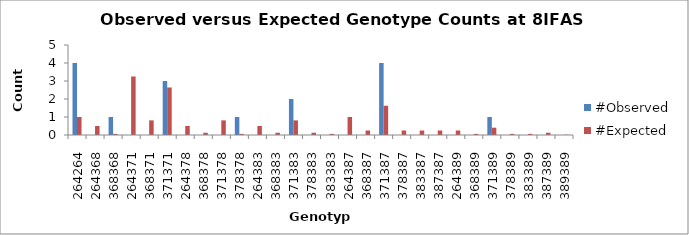
| Category | #Observed | #Expected |
|---|---|---|
| 264264.0 | 4 | 1 |
| 264368.0 | 0 | 0.5 |
| 368368.0 | 1 | 0.062 |
| 264371.0 | 0 | 3.25 |
| 368371.0 | 0 | 0.812 |
| 371371.0 | 3 | 2.641 |
| 264378.0 | 0 | 0.5 |
| 368378.0 | 0 | 0.125 |
| 371378.0 | 0 | 0.812 |
| 378378.0 | 1 | 0.062 |
| 264383.0 | 0 | 0.5 |
| 368383.0 | 0 | 0.125 |
| 371383.0 | 2 | 0.812 |
| 378383.0 | 0 | 0.125 |
| 383383.0 | 0 | 0.062 |
| 264387.0 | 0 | 1 |
| 368387.0 | 0 | 0.25 |
| 371387.0 | 4 | 1.625 |
| 378387.0 | 0 | 0.25 |
| 383387.0 | 0 | 0.25 |
| 387387.0 | 0 | 0.25 |
| 264389.0 | 0 | 0.25 |
| 368389.0 | 0 | 0.062 |
| 371389.0 | 1 | 0.406 |
| 378389.0 | 0 | 0.062 |
| 383389.0 | 0 | 0.062 |
| 387389.0 | 0 | 0.125 |
| 389389.0 | 0 | 0.016 |